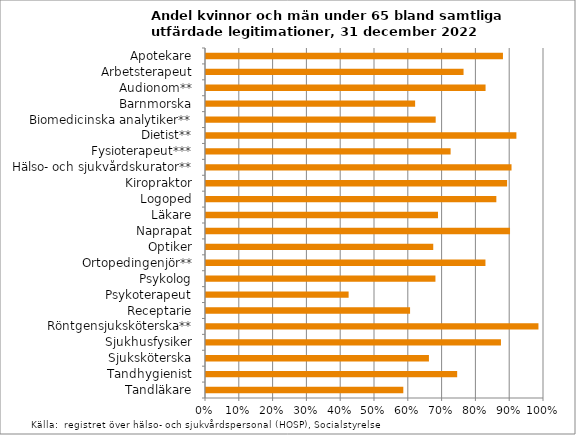
| Category | Andel under 65 |
|---|---|
| Apotekare | 0.879 |
| Arbetsterapeut | 0.762 |
| Audionom** | 0.827 |
| Barnmorska | 0.619 |
| Biomedicinska analytiker** | 0.68 |
| Dietist** | 0.918 |
| Fysioterapeut*** | 0.724 |
| Hälso- och sjukvårdskurator** | 0.904 |
| Kiropraktor | 0.891 |
| Logoped | 0.859 |
| Läkare | 0.686 |
| Naprapat | 0.899 |
| Optiker | 0.672 |
| Ortopedingenjör** | 0.827 |
| Psykolog | 0.679 |
| Psykoterapeut | 0.422 |
| Receptarie | 0.604 |
| Röntgensjuksköterska** | 0.984 |
| Sjukhusfysiker | 0.873 |
| Sjuksköterska | 0.66 |
| Tandhygienist | 0.743 |
| Tandläkare | 0.584 |